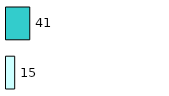
| Category | Series 0 | Series 1 |
|---|---|---|
| 0 | 15 | 41 |